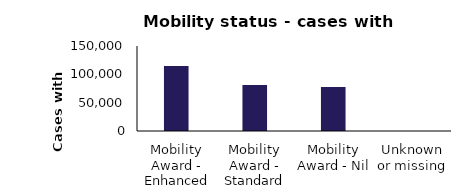
| Category | Series 0 |
|---|---|
| Mobility Award - Enhanced | 114698 |
| Mobility Award - Standard | 81335 |
| Mobility Award - Nil | 77852 |
| Unknown or missing | 17 |